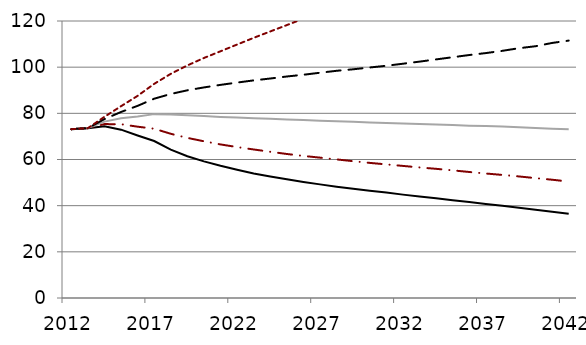
| Category | Series 0 | Series 1 | Series 2 | Series 3 | 90th rrtrrrrrrr  - 7.00% |
|---|---|---|---|---|---|
| 2012.0 | 73.14 | 73.14 | 73.14 | 73.14 | 73.14 |
| 2013.0 | 73.587 | 73.587 | 73.587 | 73.587 | 73.587 |
| 2014.0 | 74.354 | 75.34 | 76.423 | 77.505 | 78.486 |
| 2015.0 | 72.926 | 75.274 | 77.911 | 80.585 | 83.092 |
| 2016.0 | 70.392 | 74.216 | 78.612 | 83.242 | 87.574 |
| 2017.0 | 67.997 | 73.331 | 79.653 | 86.344 | 92.769 |
| 2018.0 | 64.249 | 71.144 | 79.446 | 88.395 | 97.117 |
| 2019.0 | 61.426 | 69.367 | 79.165 | 89.975 | 100.75 |
| 2020.0 | 59.198 | 67.89 | 78.842 | 91.225 | 103.98 |
| 2021.0 | 57.254 | 66.53 | 78.446 | 92.331 | 106.89 |
| 2022.0 | 55.539 | 65.379 | 78.18 | 93.325 | 109.8 |
| 2023.0 | 53.964 | 64.345 | 77.864 | 94.274 | 112.71 |
| 2024.0 | 52.655 | 63.352 | 77.62 | 95.084 | 115.47 |
| 2025.0 | 51.398 | 62.386 | 77.355 | 95.963 | 118.23 |
| 2026.0 | 50.269 | 61.549 | 77.071 | 96.708 | 121 |
| 2027.0 | 49.224 | 60.804 | 76.813 | 97.591 | 123.86 |
| 2028.0 | 48.221 | 60.042 | 76.523 | 98.428 | 126.76 |
| 2029.0 | 47.339 | 59.27 | 76.362 | 99.081 | 129.57 |
| 2030.0 | 46.457 | 58.531 | 76.05 | 99.855 | 132.38 |
| 2031.0 | 45.674 | 57.88 | 75.792 | 100.61 | 135.5 |
| 2032.0 | 44.781 | 57.222 | 75.647 | 101.49 | 138.61 |
| 2033.0 | 43.957 | 56.559 | 75.392 | 102.4 | 141.75 |
| 2034.0 | 43.19 | 55.96 | 75.18 | 103.36 | 145.09 |
| 2035.0 | 42.363 | 55.3 | 74.926 | 104.31 | 148.45 |
| 2036.0 | 41.546 | 54.594 | 74.65 | 105.26 | 151.91 |
| 2037.0 | 40.773 | 53.935 | 74.467 | 106.1 | 155.61 |
| 2038.0 | 39.921 | 53.316 | 74.258 | 107.08 | 159.47 |
| 2039.0 | 39.069 | 52.66 | 73.94 | 108.22 | 163.64 |
| 2040.0 | 38.244 | 51.928 | 73.625 | 109.07 | 168.02 |
| 2041.0 | 37.373 | 51.24 | 73.279 | 110.49 | 173.01 |
| 2042.0 | 36.473 | 50.453 | 73.084 | 111.51 | 178 |